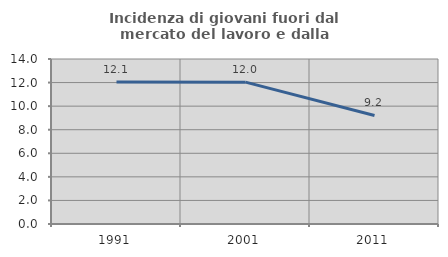
| Category | Incidenza di giovani fuori dal mercato del lavoro e dalla formazione  |
|---|---|
| 1991.0 | 12.058 |
| 2001.0 | 12.034 |
| 2011.0 | 9.211 |